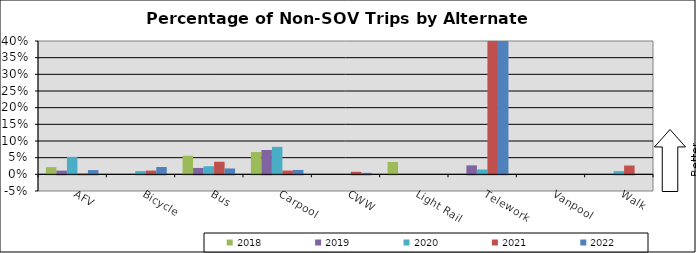
| Category | 2018 | 2019 | 2020 | 2021 | 2022 |
|---|---|---|---|---|---|
| AFV | 0.022 | 0.011 | 0.052 | 0.002 | 0.013 |
| Bicycle | 0 | 0 | 0.01 | 0.011 | 0.022 |
| Bus | 0.056 | 0.019 | 0.024 | 0.038 | 0.018 |
| Carpool | 0.067 | 0.073 | 0.083 | 0.011 | 0.013 |
| CWW | 0 | 0 | 0 | 0.008 | 0.004 |
| Light Rail | 0.037 | 0 | 0 | 0 | 0 |
| Telework | 0 | 0.027 | 0.015 | 0.634 | 0.595 |
| Vanpool | 0 | 0 | 0 | 0 | 0 |
| Walk | 0 | 0 | 0.01 | 0.026 | 0 |